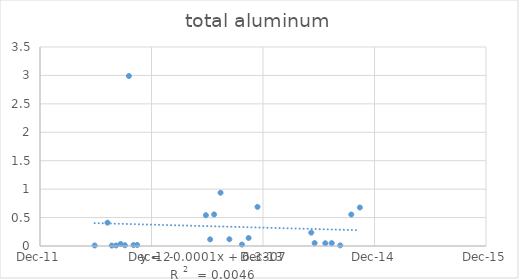
| Category | Series 0 |
|---|---|
| 41059.0 | 0.009 |
| 41101.0 | 0.41 |
| 41115.0 | 0.008 |
| 41129.0 | 0.009 |
| 41144.0 | 0.035 |
| 41158.0 | 0.013 |
| 41171.0 | 2.99 |
| 41186.0 | 0.015 |
| 41198.0 | 0.018 |
| 41423.0 | 0.542 |
| 41437.0 | 0.117 |
| 41450.0 | 0.555 |
| 41471.0 | 0.937 |
| 41500.0 | 0.119 |
| 41541.0 | 0.025 |
| 41563.0 | 0.141 |
| 41592.0 | 0.688 |
| 41768.0 | 0.235 |
| 41779.0 | 0.052 |
| 41814.0 | 0.049 |
| 41835.0 | 0.05 |
| 41863.0 | 0.011 |
| 41899.0 | 0.554 |
| 41927.0 | 0.677 |